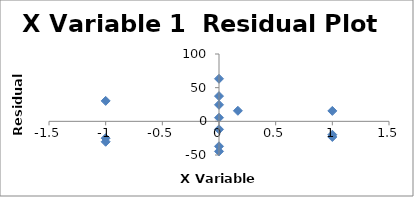
| Category | Series 0 |
|---|---|
| -1.0 | 30.346 |
| 1.0 | 15.477 |
| -1.0 | -30.364 |
| 1.0 | -23.234 |
| 0.0 | 5.341 |
| 0.0 | -11.873 |
| 0.0 | 63.201 |
| -1.0 | -25.009 |
| 1.0 | -19.878 |
| 0.0 | -37.088 |
| 0.0 | -44.584 |
| 0.0 | 24.556 |
| 0.0 | 37.459 |
| 0.16666666666666666 | 15.651 |